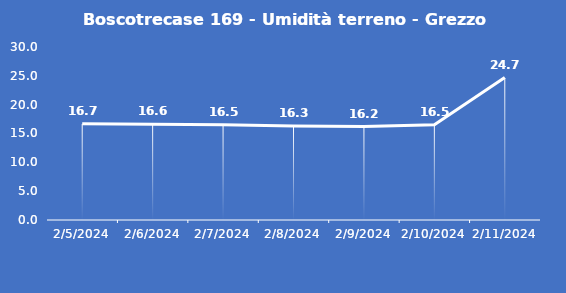
| Category | Boscotrecase 169 - Umidità terreno - Grezzo (%VWC) |
|---|---|
| 2/5/24 | 16.7 |
| 2/6/24 | 16.6 |
| 2/7/24 | 16.5 |
| 2/8/24 | 16.3 |
| 2/9/24 | 16.2 |
| 2/10/24 | 16.5 |
| 2/11/24 | 24.7 |